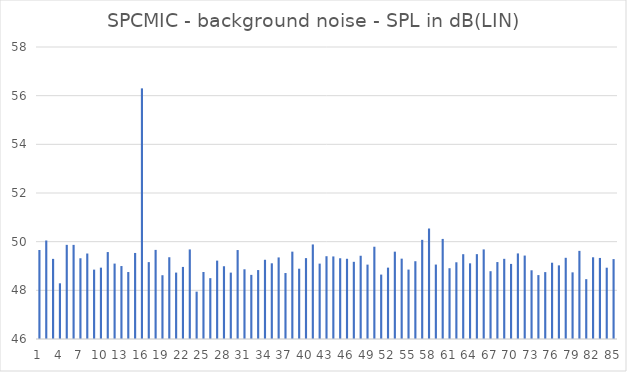
| Category | Series 0 |
|---|---|
| 0 | 49.658 |
| 1 | 50.049 |
| 2 | 49.293 |
| 3 | 48.289 |
| 4 | 49.869 |
| 5 | 49.868 |
| 6 | 49.318 |
| 7 | 49.513 |
| 8 | 48.851 |
| 9 | 48.932 |
| 10 | 49.573 |
| 11 | 49.099 |
| 12 | 48.998 |
| 13 | 48.752 |
| 14 | 49.536 |
| 15 | 56.3 |
| 16 | 49.159 |
| 17 | 49.662 |
| 18 | 48.621 |
| 19 | 49.36 |
| 20 | 48.729 |
| 21 | 48.962 |
| 22 | 49.681 |
| 23 | 47.946 |
| 24 | 48.753 |
| 25 | 48.5 |
| 26 | 49.221 |
| 27 | 48.99 |
| 28 | 48.728 |
| 29 | 49.656 |
| 30 | 48.865 |
| 31 | 48.635 |
| 32 | 48.833 |
| 33 | 49.256 |
| 34 | 49.111 |
| 35 | 49.352 |
| 36 | 48.711 |
| 37 | 49.59 |
| 38 | 48.889 |
| 39 | 49.324 |
| 40 | 49.886 |
| 41 | 49.098 |
| 42 | 49.402 |
| 43 | 49.393 |
| 44 | 49.318 |
| 45 | 49.297 |
| 46 | 49.172 |
| 47 | 49.421 |
| 48 | 49.057 |
| 49 | 49.792 |
| 50 | 48.647 |
| 51 | 48.933 |
| 52 | 49.589 |
| 53 | 49.302 |
| 54 | 48.853 |
| 55 | 49.196 |
| 56 | 50.075 |
| 57 | 50.541 |
| 58 | 49.059 |
| 59 | 50.113 |
| 60 | 48.909 |
| 61 | 49.153 |
| 62 | 49.485 |
| 63 | 49.11 |
| 64 | 49.487 |
| 65 | 49.682 |
| 66 | 48.786 |
| 67 | 49.162 |
| 68 | 49.295 |
| 69 | 49.086 |
| 70 | 49.517 |
| 71 | 49.429 |
| 72 | 48.824 |
| 73 | 48.626 |
| 74 | 48.749 |
| 75 | 49.135 |
| 76 | 49.026 |
| 77 | 49.337 |
| 78 | 48.739 |
| 79 | 49.622 |
| 80 | 48.459 |
| 81 | 49.358 |
| 82 | 49.331 |
| 83 | 48.93 |
| 84 | 49.283 |